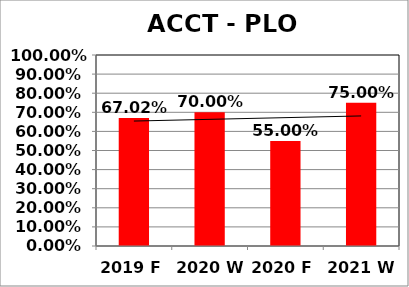
| Category | Series 0 |
|---|---|
| 2019 F | 0.67 |
| 2020 W | 0.7 |
| 2020 F | 0.55 |
| 2021 W | 0.75 |